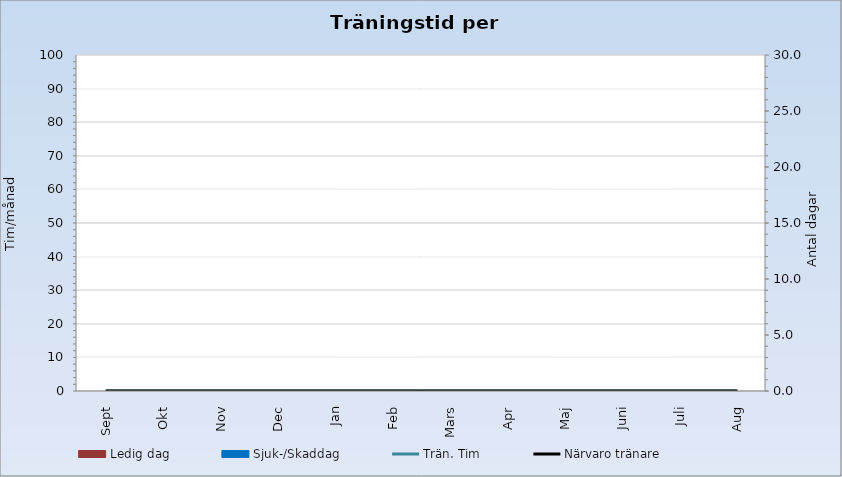
| Category | Ledig dag | Sjuk-/Skaddag |
|---|---|---|
| Sept | 0 | 0 |
| Okt | 0 | 0 |
| Nov | 0 | 0 |
| Dec | 0 | 0 |
| Jan | 0 | 0 |
| Feb | 0 | 0 |
| Mars | 0 | 0 |
| Apr | 0 | 0 |
| Maj | 0 | 0 |
| Juni | 0 | 0 |
| Juli | 0 | 0 |
| Aug | 0 | 0 |